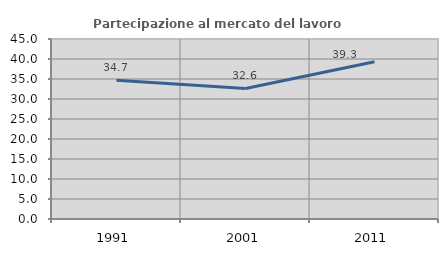
| Category | Partecipazione al mercato del lavoro  femminile |
|---|---|
| 1991.0 | 34.684 |
| 2001.0 | 32.642 |
| 2011.0 | 39.322 |